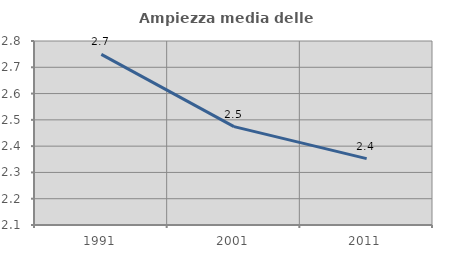
| Category | Ampiezza media delle famiglie |
|---|---|
| 1991.0 | 2.749 |
| 2001.0 | 2.474 |
| 2011.0 | 2.353 |